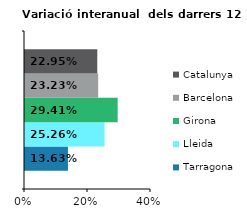
| Category | Tarragona | Lleida | Girona | Barcelona | Catalunya |
|---|---|---|---|---|---|
| 0 | 0.136 | 0.253 | 0.294 | 0.232 | 0.229 |